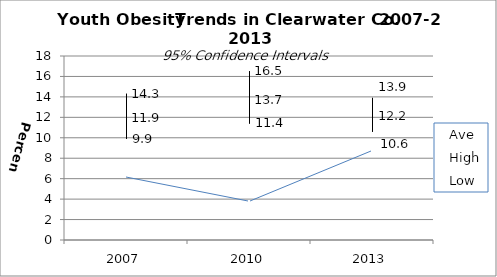
| Category | Ave | High | Low |
|---|---|---|---|
| 2007.0 | 11.9 | 14.3 | 9.9 |
| 2010.0 | 13.7 | 16.5 | 11.4 |
| 2013.0 | 12.2 | 13.9 | 10.6 |